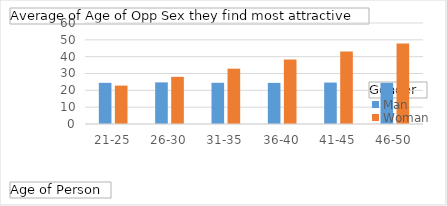
| Category | Man | Woman |
|---|---|---|
| 21-25 | 24.46 | 22.818 |
| 26-30 | 24.721 | 28.028 |
| 31-35 | 24.475 | 32.883 |
| 36-40 | 24.435 | 38.273 |
| 41-45 | 24.622 | 43.051 |
| 46-50 | 24.416 | 47.835 |